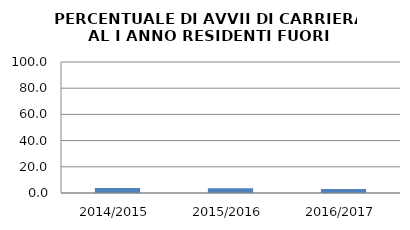
| Category | 2014/2015 2015/2016 2016/2017 |
|---|---|
| 2014/2015 | 3.75 |
| 2015/2016 | 3.548 |
| 2016/2017 | 3.04 |